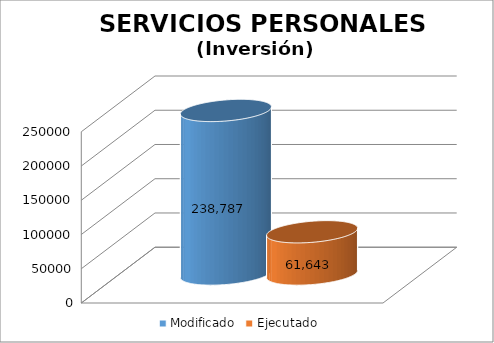
| Category | Modificado | Ejecutado |
|---|---|---|
| 0 | 238787 | 61643.43 |